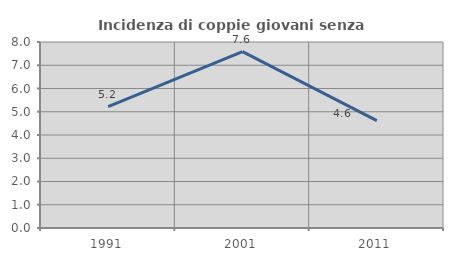
| Category | Incidenza di coppie giovani senza figli |
|---|---|
| 1991.0 | 5.217 |
| 2001.0 | 7.589 |
| 2011.0 | 4.619 |